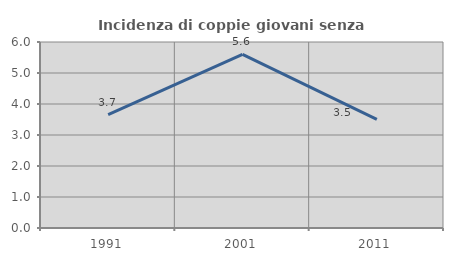
| Category | Incidenza di coppie giovani senza figli |
|---|---|
| 1991.0 | 3.654 |
| 2001.0 | 5.599 |
| 2011.0 | 3.501 |